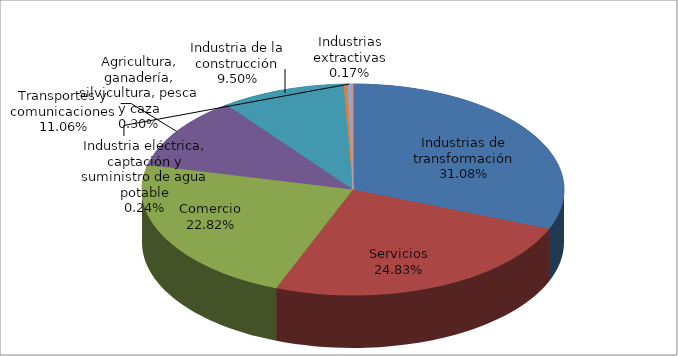
| Category | Series 0 |
|---|---|
| Industrias de transformación | 34951 |
| Servicios | 27928 |
| Comercio | 25669 |
| Transportes y comunicaciones | 12438 |
| Industria de la construcción | 10680 |
| Agricultura, ganadería, silvicultura, pesca y caza | 337 |
| Industria eléctrica, captación y suministro de agua potable | 272 |
| Industrias extractivas | 190 |